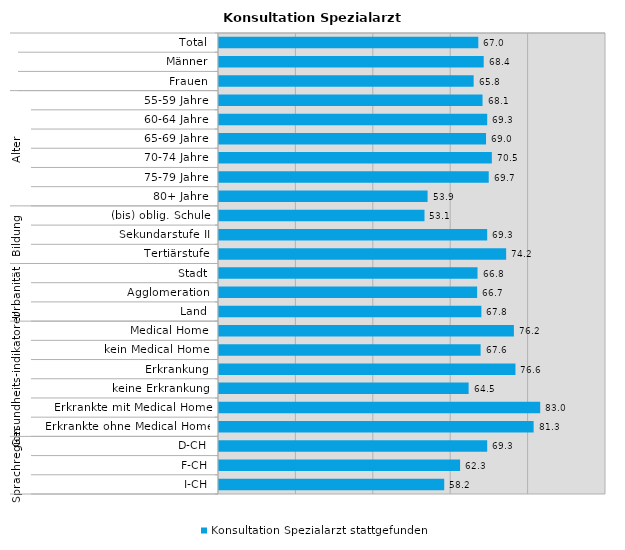
| Category | Konsultation Spezialarzt stattgefunden |
|---|---|
| 0 | 67 |
| 1 | 68.4 |
| 2 | 65.8 |
| 3 | 68.1 |
| 4 | 69.3 |
| 5 | 69 |
| 6 | 70.5 |
| 7 | 69.7 |
| 8 | 53.9 |
| 9 | 53.1 |
| 10 | 69.3 |
| 11 | 74.2 |
| 12 | 66.8 |
| 13 | 66.7 |
| 14 | 67.8 |
| 15 | 76.2 |
| 16 | 67.6 |
| 17 | 76.6 |
| 18 | 64.5 |
| 19 | 83 |
| 20 | 81.3 |
| 21 | 69.3 |
| 22 | 62.3 |
| 23 | 58.2 |